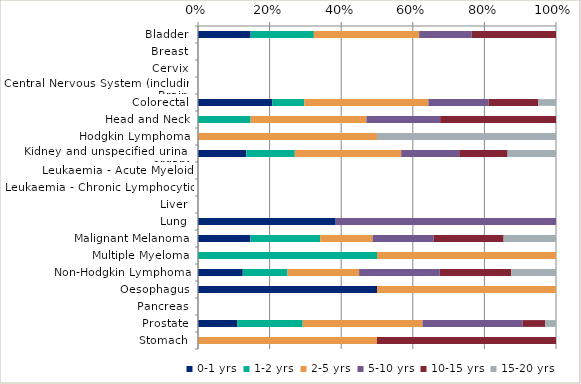
| Category | 0-1 yrs | 1-2 yrs | 2-5 yrs | 5-10 yrs | 10-15 yrs | 15-20 yrs |
|---|---|---|---|---|---|---|
| Bladder | 0.147 | 0.176 | 0.294 | 0.147 | 0.235 | 0 |
| Breast | 0 | 0 | 0 | 0 | 0 | 0 |
| Cervix | 0 | 0 | 0 | 0 | 0 | 0 |
| Central Nervous System (including Brain) | 0 | 0 | 0 | 0 | 0 | 0 |
| Colorectal | 0.208 | 0.089 | 0.347 | 0.168 | 0.139 | 0.05 |
| Head and Neck | 0 | 0.147 | 0.324 | 0.206 | 0.324 | 0 |
| Hodgkin Lymphoma | 0 | 0 | 0.5 | 0 | 0 | 0.5 |
| Kidney and unspecified urinary organs | 0.135 | 0.135 | 0.297 | 0.162 | 0.135 | 0.135 |
| Leukaemia - Acute Myeloid | 0 | 0 | 0 | 0 | 0 | 0 |
| Leukaemia - Chronic Lymphocytic | 0 | 0 | 0 | 0 | 0 | 0 |
| Liver | 0 | 0 | 0 | 0 | 0 | 0 |
| Lung | 0.385 | 0 | 0 | 0.615 | 0 | 0 |
| Malignant Melanoma | 0.146 | 0.195 | 0.146 | 0.171 | 0.195 | 0.146 |
| Multiple Myeloma | 0 | 0.5 | 0.5 | 0 | 0 | 0 |
| Non-Hodgkin Lymphoma | 0.125 | 0.125 | 0.2 | 0.225 | 0.2 | 0.125 |
| Oesophagus | 0.5 | 0 | 0.5 | 0 | 0 | 0 |
| Pancreas | 0 | 0 | 0 | 0 | 0 | 0 |
| Prostate | 0.11 | 0.182 | 0.335 | 0.28 | 0.064 | 0.03 |
| Stomach | 0 | 0 | 0.5 | 0 | 0.5 | 0 |